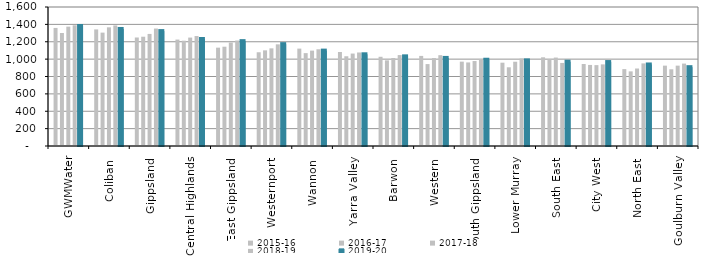
| Category | 2015-16 | 2016-17 | 2017-18 | 2018-19 | 2019-20 |
|---|---|---|---|---|---|
| GWMWater | 1359 | 1301 | 1374 | 1389.623 | 1381.085 |
| Coliban  | 1342 | 1305 | 1366 | 1388.193 | 1347.154 |
| Gippsland  | 1249 | 1258 | 1290 | 1351.933 | 1322.685 |
| Central Highlands  | 1225 | 1212 | 1248 | 1265.837 | 1231.571 |
| East Gippsland  | 1132 | 1143 | 1191 | 1214.102 | 1207.088 |
| Westernport  | 1079 | 1101 | 1124 | 1170.176 | 1172.379 |
| Wannon  | 1121 | 1069 | 1098 | 1113.35 | 1097.938 |
| Yarra Valley  | 1082 | 1033 | 1064 | 1076.551 | 1055.611 |
| Barwon  | 1027 | 986 | 1013 | 1046.668 | 1031.825 |
| Western  | 1037 | 943 | 1012 | 1045.405 | 1013.795 |
| South Gippsland  | 971 | 962 | 978 | 998.825 | 992.918 |
| Lower Murray  | 959 | 906 | 970 | 1006.792 | 985.397 |
| South East  | 1021 | 998 | 1018 | 956.099 | 970.26 |
| City West  | 944 | 933 | 931 | 939.386 | 966.267 |
| North East  | 885 | 859 | 892 | 950.859 | 938.421 |
| Goulburn Valley  | 925 | 883 | 925 | 948.669 | 907.38 |